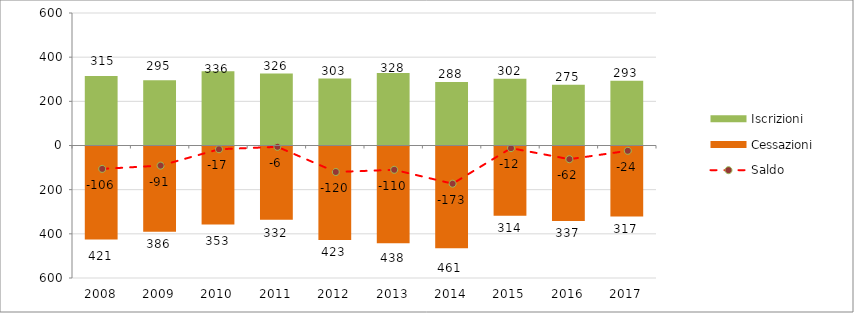
| Category | Iscrizioni | Cessazioni |
|---|---|---|
| 2008.0 | 315 | -421 |
| 2009.0 | 295 | -386 |
| 2010.0 | 336 | -353 |
| 2011.0 | 326 | -332 |
| 2012.0 | 303 | -423 |
| 2013.0 | 328 | -438 |
| 2014.0 | 288 | -461 |
| 2015.0 | 302 | -314 |
| 2016.0 | 275 | -337 |
| 2017.0 | 293 | -317 |